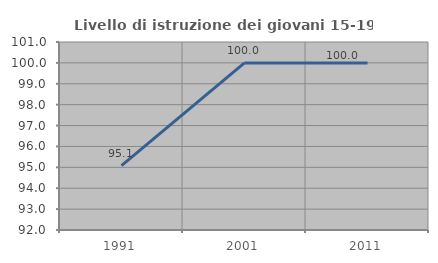
| Category | Livello di istruzione dei giovani 15-19 anni |
|---|---|
| 1991.0 | 95.082 |
| 2001.0 | 100 |
| 2011.0 | 100 |